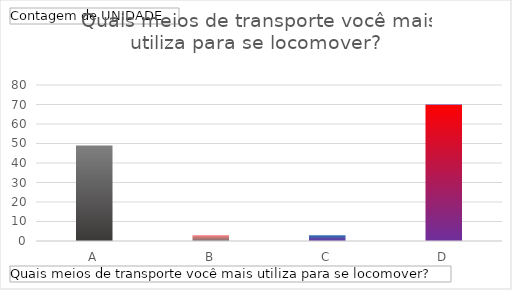
| Category | Total |
|---|---|
| A | 49 |
| B | 3 |
| C | 3 |
| D | 70 |